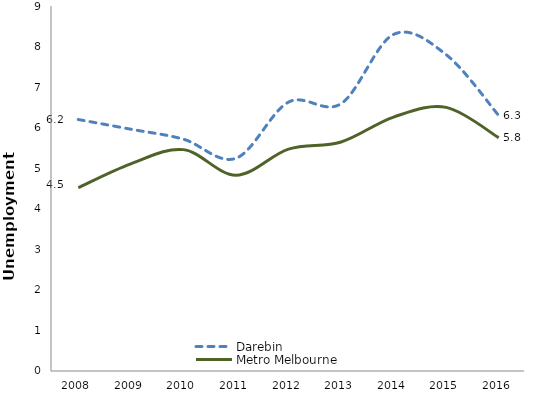
| Category | Darebin  | Metro Melbourne |
|---|---|---|
| 2008.0 | 6.201 | 4.52 |
| 2009.0 | 5.962 | 5.109 |
| 2010.0 | 5.716 | 5.459 |
| 2011.0 | 5.244 | 4.827 |
| 2012.0 | 6.63 | 5.471 |
| 2013.0 | 6.591 | 5.647 |
| 2014.0 | 8.3 | 6.261 |
| 2015.0 | 7.8 | 6.5 |
| 2016.0 | 6.3 | 5.752 |